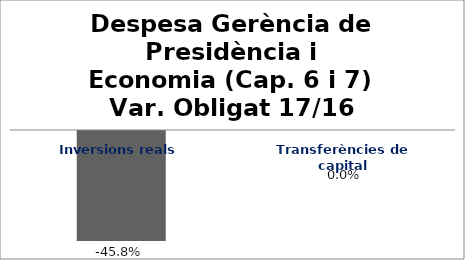
| Category | Series 0 |
|---|---|
| Inversions reals | -0.458 |
| Transferències de capital | 0 |